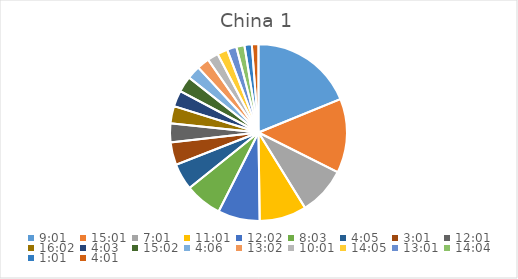
| Category | Series 0 |
|---|---|
| 0.3756944444444445 | 19.888 |
| 0.6256944444444444 | 14.316 |
| 0.2923611111111111 | 9.295 |
| 0.4590277777777778 | 9.072 |
| 0.5013888888888889 | 8.081 |
| 0.3354166666666667 | 7.161 |
| 0.17013888888888887 | 5.108 |
| 0.12569444444444444 | 4.39 |
| 0.5006944444444444 | 3.632 |
| 0.6680555555555556 | 3.332 |
| 0.16874999999999998 | 3.083 |
| 0.6263888888888889 | 3.083 |
| 0.1708333333333333 | 2.589 |
| 0.5430555555555555 | 2.392 |
| 0.4173611111111111 | 2.099 |
| 0.5868055555555556 | 2.002 |
| 0.5423611111111112 | 1.808 |
| 0.5861111111111111 | 1.566 |
| 0.042361111111111106 | 1.422 |
| 0.1673611111111111 | 1.278 |